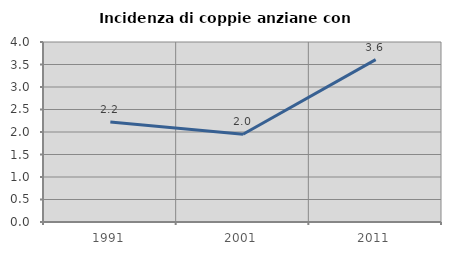
| Category | Incidenza di coppie anziane con figli |
|---|---|
| 1991.0 | 2.222 |
| 2001.0 | 1.95 |
| 2011.0 | 3.609 |